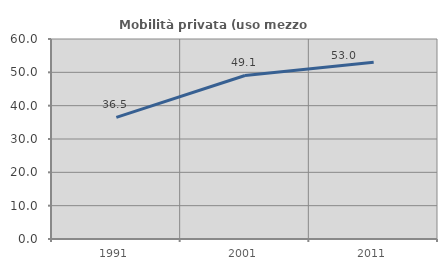
| Category | Mobilità privata (uso mezzo privato) |
|---|---|
| 1991.0 | 36.495 |
| 2001.0 | 49.054 |
| 2011.0 | 53.043 |